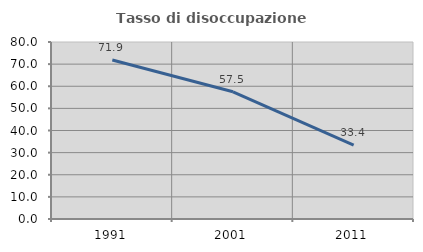
| Category | Tasso di disoccupazione giovanile  |
|---|---|
| 1991.0 | 71.872 |
| 2001.0 | 57.506 |
| 2011.0 | 33.407 |